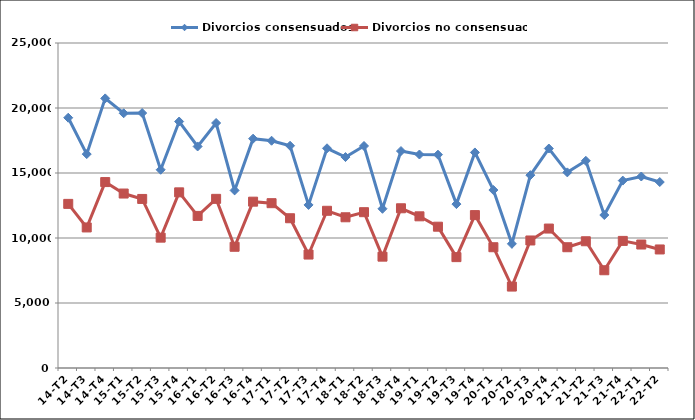
| Category | Divorcios consensuados | Divorcios no consensuados |
|---|---|---|
| 14-T2 | 19251 | 12625 |
| 14-T3 | 16454 | 10812 |
| 14-T4 | 20739 | 14302 |
| 15-T1 | 19595 | 13420 |
| 15-T2 | 19612 | 13004 |
| 15-T3 | 15249 | 10027 |
| 15-T4 | 18958 | 13512 |
| 16-T1 | 17041 | 11699 |
| 16-T2 | 18847 | 13011 |
| 16-T3 | 13660 | 9325 |
| 16-T4 | 17641 | 12795 |
| 17-T1 | 17483 | 12679 |
| 17-T2 | 17095 | 11520 |
| 17-T3 | 12545 | 8727 |
| 17-T4 | 16901 | 12093 |
| 18-T1 | 16226 | 11594 |
| 18-T2 | 17077 | 11986 |
| 18-T3 | 12249 | 8566 |
| 18-T4 | 16689 | 12287 |
| 19-T1 | 16423 | 11668 |
| 19-T2 | 16409 | 10869 |
| 19-T3 | 12607 | 8528 |
| 19-T4 | 16581 | 11761 |
| 20-T1 | 13690 | 9290 |
| 20-T2 | 9552 | 6264 |
| 20-T3 | 14835 | 9809 |
| 20-T4 | 16883 | 10727 |
| 21-T1 | 15048 | 9290 |
| 21-T2 | 15937 | 9750 |
| 21-T3 | 11767 | 7520 |
| 21-T4 | 14416 | 9777 |
| 22-T1 | 14730 | 9498 |
| 22-T2 | 14306 | 9118 |